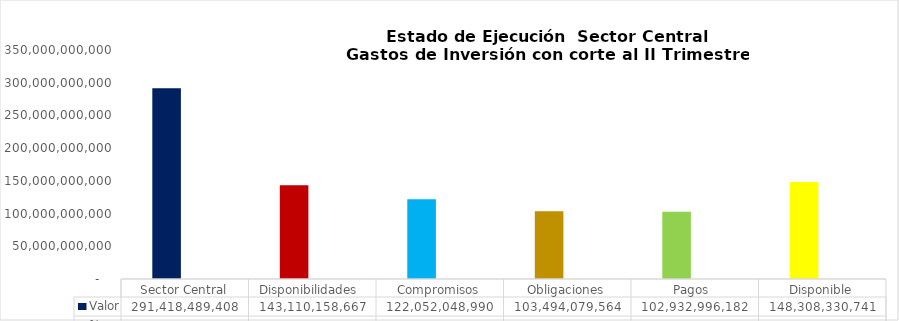
| Category | Valor | % |
|---|---|---|
| Sector Central | 291418489407.71 | 1 |
| Disponibilidades  | 143110158667.04 | 0.491 |
| Compromisos | 122052048989.84 | 0.419 |
| Obligaciones | 103494079564.14 | 0.848 |
| Pagos  | 102932996182.14 | 0.843 |
| Disponible | 148308330740.67 | 0.509 |